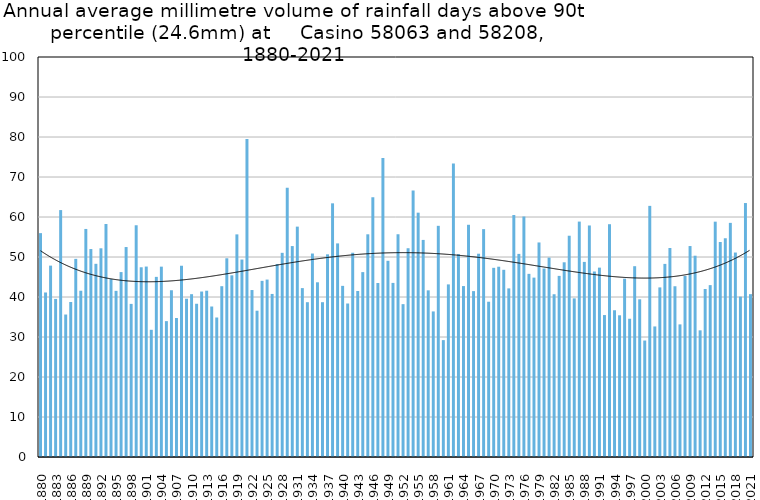
| Category | Annual average mm in days above 90th percentile |
|---|---|
| 1880 | 55.967 |
| 1881 | 41.129 |
| 1882 | 47.844 |
| 1883 | 39.52 |
| 1884 | 61.729 |
| 1885 | 35.62 |
| 1886 | 38.754 |
| 1887 | 49.537 |
| 1888 | 41.567 |
| 1889 | 57.013 |
| 1890 | 51.992 |
| 1891 | 48.3 |
| 1892 | 52.176 |
| 1893 | 58.257 |
| 1894 | 44.473 |
| 1895 | 41.536 |
| 1896 | 46.23 |
| 1897 | 52.489 |
| 1898 | 38.278 |
| 1899 | 57.936 |
| 1900 | 47.43 |
| 1901 | 47.612 |
| 1902 | 31.8 |
| 1903 | 45.033 |
| 1904 | 47.589 |
| 1905 | 33.967 |
| 1906 | 41.688 |
| 1907 | 34.745 |
| 1908 | 47.817 |
| 1909 | 39.567 |
| 1910 | 40.707 |
| 1911 | 38.31 |
| 1912 | 41.367 |
| 1913 | 41.575 |
| 1914 | 37.625 |
| 1915 | 34.875 |
| 1916 | 42.7 |
| 1917 | 49.681 |
| 1918 | 45.422 |
| 1919 | 55.656 |
| 1920 | 49.367 |
| 1921 | 79.5 |
| 1922 | 41.74 |
| 1923 | 36.575 |
| 1924 | 44.038 |
| 1925 | 44.357 |
| 1926 | 40.767 |
| 1927 | 48.229 |
| 1928 | 51.044 |
| 1929 | 67.291 |
| 1930 | 52.733 |
| 1931 | 57.593 |
| 1932 | 42.222 |
| 1933 | 38.7 |
| 1934 | 50.87 |
| 1935 | 43.678 |
| 1936 | 38.7 |
| 1937 | 50.669 |
| 1938 | 63.417 |
| 1939 | 53.4 |
| 1940 | 42.786 |
| 1941 | 38.373 |
| 1942 | 51.067 |
| 1943 | 41.5 |
| 1944 | 46.22 |
| 1945 | 55.675 |
| 1946 | 64.909 |
| 1947 | 43.506 |
| 1948 | 74.743 |
| 1949 | 49.046 |
| 1950 | 43.524 |
| 1951 | 55.688 |
| 1952 | 38.214 |
| 1953 | 52.194 |
| 1954 | 66.625 |
| 1955 | 61.083 |
| 1956 | 54.271 |
| 1957 | 41.667 |
| 1958 | 36.393 |
| 1959 | 57.794 |
| 1960 | 29.22 |
| 1961 | 43.15 |
| 1962 | 73.354 |
| 1963 | 50.725 |
| 1964 | 42.733 |
| 1965 | 58.056 |
| 1966 | 41.471 |
| 1967 | 50.82 |
| 1968 | 56.967 |
| 1969 | 38.818 |
| 1970 | 47.292 |
| 1971 | 47.571 |
| 1972 | 46.8 |
| 1973 | 42.15 |
| 1974 | 60.489 |
| 1975 | 50.778 |
| 1976 | 60.123 |
| 1977 | 45.788 |
| 1978 | 44.845 |
| 1979 | 53.636 |
| 1980 | 47.12 |
| 1981 | 49.844 |
| 1982 | 40.689 |
| 1983 | 45.28 |
| 1984 | 48.679 |
| 1985 | 55.32 |
| 1986 | 39.657 |
| 1987 | 58.853 |
| 1988 | 48.774 |
| 1989 | 57.882 |
| 1990 | 46.378 |
| 1991 | 47.343 |
| 1992 | 35.486 |
| 1993 | 58.2 |
| 1994 | 36.686 |
| 1995 | 35.425 |
| 1996 | 44.578 |
| 1997 | 34.567 |
| 1998 | 47.7 |
| 1999 | 39.427 |
| 2000 | 29.117 |
| 2001 | 62.783 |
| 2002 | 32.64 |
| 2003 | 42.4 |
| 2004 | 48.277 |
| 2005 | 52.25 |
| 2006 | 42.688 |
| 2007 | 33.156 |
| 2008 | 45.26 |
| 2009 | 52.738 |
| 2010 | 50.323 |
| 2011 | 31.667 |
| 2012 | 42 |
| 2013 | 42.97 |
| 2014 | 58.833 |
| 2015 | 53.745 |
| 2016 | 54.686 |
| 2017 | 58.533 |
| 2018 | 51.114 |
| 2019 | 40.086 |
| 2020 | 63.491 |
| 2021 | 40.711 |